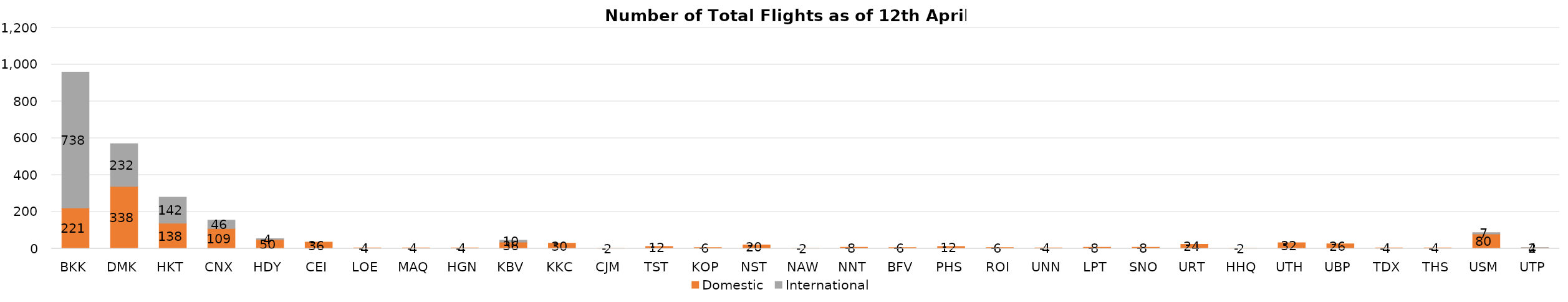
| Category | Domestic | International |
|---|---|---|
| BKK | 221 | 738 |
| DMK | 338 | 232 |
| HKT | 138 | 142 |
| CNX | 109 | 46 |
| HDY | 50 | 4 |
| CEI | 36 | 0 |
| LOE | 4 | 0 |
| MAQ | 4 | 0 |
| HGN | 4 | 0 |
| KBV | 36 | 10 |
| KKC | 30 | 0 |
| CJM | 2 | 0 |
| TST | 12 | 0 |
| KOP | 6 | 0 |
| NST | 20 | 0 |
| NAW | 2 | 0 |
| NNT | 8 | 0 |
| BFV | 6 | 0 |
| PHS | 12 | 0 |
| ROI | 6 | 0 |
| UNN | 4 | 0 |
| LPT | 8 | 0 |
| SNO | 8 | 0 |
| URT | 24 | 0 |
| HHQ | 2 | 0 |
| UTH | 32 | 0 |
| UBP | 26 | 0 |
| TDX | 4 | 0 |
| THS | 4 | 0 |
| USM | 80 | 7 |
| UTP | 4 | 2 |